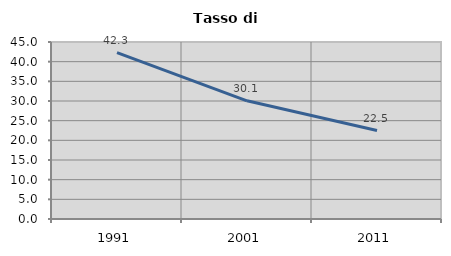
| Category | Tasso di disoccupazione   |
|---|---|
| 1991.0 | 42.294 |
| 2001.0 | 30.055 |
| 2011.0 | 22.493 |